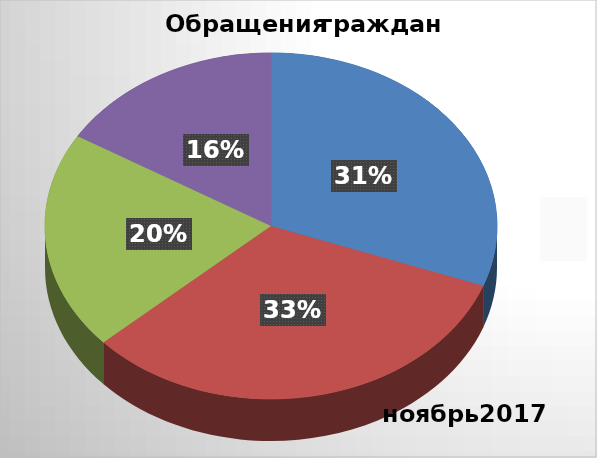
| Category | Series 0 |
|---|---|
| ЗВО | 15 |
| ЦВО | 16 |
| ЮВО | 10 |
| ВВО | 8 |